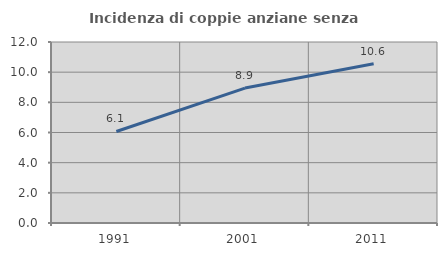
| Category | Incidenza di coppie anziane senza figli  |
|---|---|
| 1991.0 | 6.069 |
| 2001.0 | 8.947 |
| 2011.0 | 10.556 |